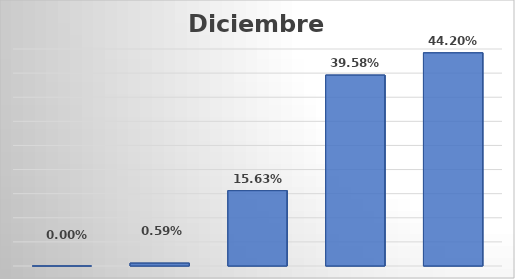
| Category | Series 0 |
|---|---|
| CDU | 0 |
| CMC | 0.006 |
| CP | 0.156 |
| PE | 0.396 |
| LP | 0.442 |